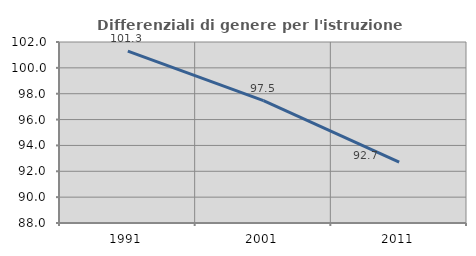
| Category | Differenziali di genere per l'istruzione superiore |
|---|---|
| 1991.0 | 101.298 |
| 2001.0 | 97.466 |
| 2011.0 | 92.712 |